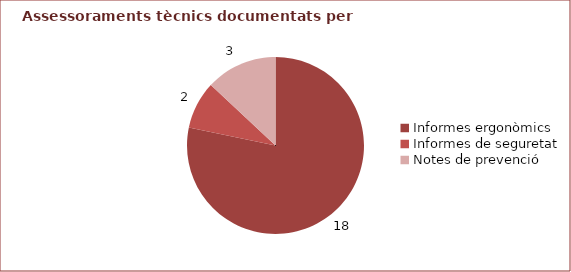
| Category | Series 0 |
|---|---|
| Informes ergonòmics | 18 |
| Informes de seguretat | 2 |
| Notes de prevenció | 3 |